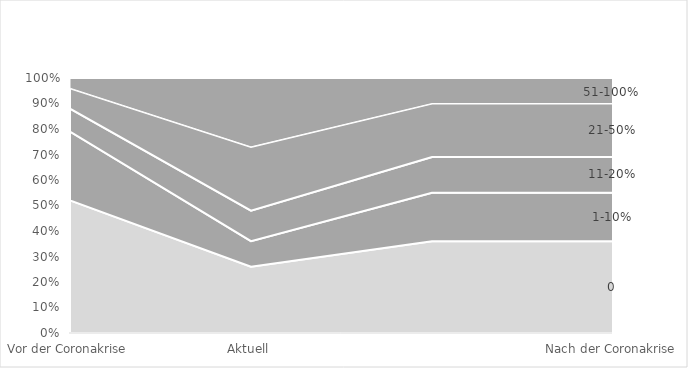
| Category | 0% | 1-10% | 11-20% | 21-50% | 51-100% |
|---|---|---|---|---|---|
| Vor der Coronakrise | 0.52 | 0.27 | 0.09 | 0.08 | 0.04 |
| Aktuell | 0.26 | 0.1 | 0.12 | 0.25 | 0.27 |
|  | 0.36 | 0.19 | 0.14 | 0.21 | 0.1 |
| Nach der Coronakrise | 0.36 | 0.19 | 0.14 | 0.21 | 0.1 |